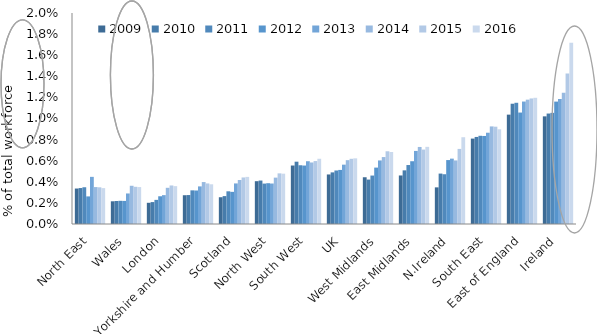
| Category | 2009 | 2010 | 2011 | 2012 | 2013 | 2014 | 2015 | 2016 |
|---|---|---|---|---|---|---|---|---|
| North East | 0.003 | 0.003 | 0.003 | 0.003 | 0.004 | 0.003 | 0.003 | 0.003 |
| Wales | 0.002 | 0.002 | 0.002 | 0.002 | 0.003 | 0.004 | 0.004 | 0.004 |
| London | 0.002 | 0.002 | 0.002 | 0.003 | 0.003 | 0.003 | 0.004 | 0.004 |
| Yorkshire and Humber | 0.003 | 0.003 | 0.003 | 0.003 | 0.004 | 0.004 | 0.004 | 0.004 |
| Scotland | 0.003 | 0.003 | 0.003 | 0.003 | 0.004 | 0.004 | 0.004 | 0.004 |
| North West | 0.004 | 0.004 | 0.004 | 0.004 | 0.004 | 0.004 | 0.005 | 0.005 |
| South West | 0.006 | 0.006 | 0.006 | 0.006 | 0.006 | 0.006 | 0.006 | 0.006 |
| UK | 0.005 | 0.005 | 0.005 | 0.005 | 0.006 | 0.006 | 0.006 | 0.006 |
| West Midlands | 0.004 | 0.004 | 0.005 | 0.005 | 0.006 | 0.006 | 0.007 | 0.007 |
| East Midlands | 0.005 | 0.005 | 0.006 | 0.006 | 0.007 | 0.007 | 0.007 | 0.007 |
| N.Ireland | 0.003 | 0.005 | 0.005 | 0.006 | 0.006 | 0.006 | 0.007 | 0.008 |
| South East | 0.008 | 0.008 | 0.008 | 0.008 | 0.009 | 0.009 | 0.009 | 0.009 |
| East of England | 0.01 | 0.011 | 0.011 | 0.011 | 0.012 | 0.012 | 0.012 | 0.012 |
| Ireland | 0.01 | 0.01 | 0.011 | 0.012 | 0.012 | 0.012 | 0.014 | 0.017 |